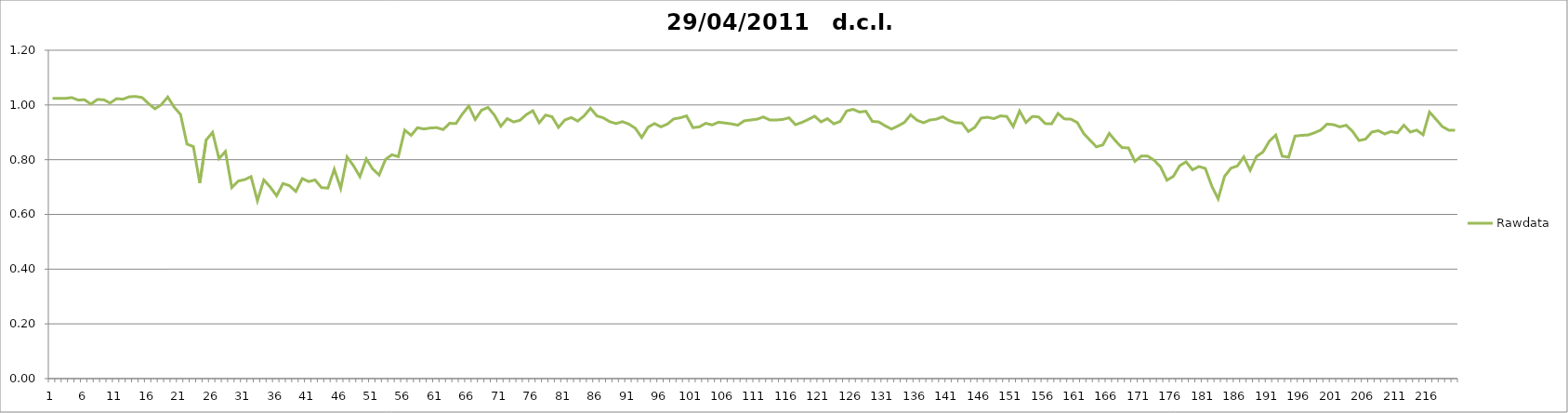
| Category | Rawdata |
|---|---|
| 0 | 1.024 |
| 1 | 1.024 |
| 2 | 1.024 |
| 3 | 1.027 |
| 4 | 1.018 |
| 5 | 1.019 |
| 6 | 1.003 |
| 7 | 1.02 |
| 8 | 1.019 |
| 9 | 1.007 |
| 10 | 1.023 |
| 11 | 1.021 |
| 12 | 1.03 |
| 13 | 1.031 |
| 14 | 1.027 |
| 15 | 1.005 |
| 16 | 0.986 |
| 17 | 1.001 |
| 18 | 1.029 |
| 19 | 0.992 |
| 20 | 0.965 |
| 21 | 0.857 |
| 22 | 0.848 |
| 23 | 0.715 |
| 24 | 0.872 |
| 25 | 0.9 |
| 26 | 0.804 |
| 27 | 0.83 |
| 28 | 0.698 |
| 29 | 0.722 |
| 30 | 0.727 |
| 31 | 0.738 |
| 32 | 0.65 |
| 33 | 0.726 |
| 34 | 0.7 |
| 35 | 0.668 |
| 36 | 0.713 |
| 37 | 0.705 |
| 38 | 0.684 |
| 39 | 0.731 |
| 40 | 0.72 |
| 41 | 0.726 |
| 42 | 0.698 |
| 43 | 0.696 |
| 44 | 0.765 |
| 45 | 0.695 |
| 46 | 0.81 |
| 47 | 0.778 |
| 48 | 0.738 |
| 49 | 0.803 |
| 50 | 0.766 |
| 51 | 0.744 |
| 52 | 0.801 |
| 53 | 0.818 |
| 54 | 0.811 |
| 55 | 0.908 |
| 56 | 0.889 |
| 57 | 0.917 |
| 58 | 0.912 |
| 59 | 0.916 |
| 60 | 0.917 |
| 61 | 0.91 |
| 62 | 0.933 |
| 63 | 0.932 |
| 64 | 0.967 |
| 65 | 0.996 |
| 66 | 0.947 |
| 67 | 0.981 |
| 68 | 0.991 |
| 69 | 0.963 |
| 70 | 0.922 |
| 71 | 0.95 |
| 72 | 0.938 |
| 73 | 0.944 |
| 74 | 0.965 |
| 75 | 0.979 |
| 76 | 0.935 |
| 77 | 0.963 |
| 78 | 0.957 |
| 79 | 0.918 |
| 80 | 0.945 |
| 81 | 0.954 |
| 82 | 0.941 |
| 83 | 0.96 |
| 84 | 0.988 |
| 85 | 0.96 |
| 86 | 0.953 |
| 87 | 0.939 |
| 88 | 0.932 |
| 89 | 0.939 |
| 90 | 0.93 |
| 91 | 0.915 |
| 92 | 0.881 |
| 93 | 0.919 |
| 94 | 0.932 |
| 95 | 0.92 |
| 96 | 0.93 |
| 97 | 0.949 |
| 98 | 0.953 |
| 99 | 0.96 |
| 100 | 0.917 |
| 101 | 0.92 |
| 102 | 0.933 |
| 103 | 0.927 |
| 104 | 0.937 |
| 105 | 0.934 |
| 106 | 0.931 |
| 107 | 0.926 |
| 108 | 0.942 |
| 109 | 0.945 |
| 110 | 0.948 |
| 111 | 0.956 |
| 112 | 0.945 |
| 113 | 0.945 |
| 114 | 0.947 |
| 115 | 0.953 |
| 116 | 0.928 |
| 117 | 0.936 |
| 118 | 0.947 |
| 119 | 0.959 |
| 120 | 0.938 |
| 121 | 0.95 |
| 122 | 0.931 |
| 123 | 0.94 |
| 124 | 0.978 |
| 125 | 0.984 |
| 126 | 0.974 |
| 127 | 0.977 |
| 128 | 0.94 |
| 129 | 0.938 |
| 130 | 0.924 |
| 131 | 0.912 |
| 132 | 0.923 |
| 133 | 0.936 |
| 134 | 0.964 |
| 135 | 0.944 |
| 136 | 0.935 |
| 137 | 0.945 |
| 138 | 0.948 |
| 139 | 0.957 |
| 140 | 0.943 |
| 141 | 0.935 |
| 142 | 0.934 |
| 143 | 0.903 |
| 144 | 0.918 |
| 145 | 0.952 |
| 146 | 0.955 |
| 147 | 0.95 |
| 148 | 0.96 |
| 149 | 0.958 |
| 150 | 0.921 |
| 151 | 0.978 |
| 152 | 0.936 |
| 153 | 0.958 |
| 154 | 0.956 |
| 155 | 0.932 |
| 156 | 0.931 |
| 157 | 0.969 |
| 158 | 0.949 |
| 159 | 0.948 |
| 160 | 0.936 |
| 161 | 0.896 |
| 162 | 0.871 |
| 163 | 0.847 |
| 164 | 0.854 |
| 165 | 0.896 |
| 166 | 0.868 |
| 167 | 0.844 |
| 168 | 0.843 |
| 169 | 0.794 |
| 170 | 0.813 |
| 171 | 0.813 |
| 172 | 0.798 |
| 173 | 0.774 |
| 174 | 0.725 |
| 175 | 0.739 |
| 176 | 0.778 |
| 177 | 0.792 |
| 178 | 0.763 |
| 179 | 0.775 |
| 180 | 0.768 |
| 181 | 0.704 |
| 182 | 0.657 |
| 183 | 0.739 |
| 184 | 0.769 |
| 185 | 0.777 |
| 186 | 0.81 |
| 187 | 0.761 |
| 188 | 0.812 |
| 189 | 0.828 |
| 190 | 0.868 |
| 191 | 0.89 |
| 192 | 0.813 |
| 193 | 0.809 |
| 194 | 0.886 |
| 195 | 0.889 |
| 196 | 0.89 |
| 197 | 0.898 |
| 198 | 0.908 |
| 199 | 0.93 |
| 200 | 0.928 |
| 201 | 0.92 |
| 202 | 0.926 |
| 203 | 0.903 |
| 204 | 0.87 |
| 205 | 0.875 |
| 206 | 0.901 |
| 207 | 0.906 |
| 208 | 0.894 |
| 209 | 0.903 |
| 210 | 0.898 |
| 211 | 0.926 |
| 212 | 0.901 |
| 213 | 0.908 |
| 214 | 0.891 |
| 215 | 0.974 |
| 216 | 0.948 |
| 217 | 0.921 |
| 218 | 0.908 |
| 219 | 0.908 |